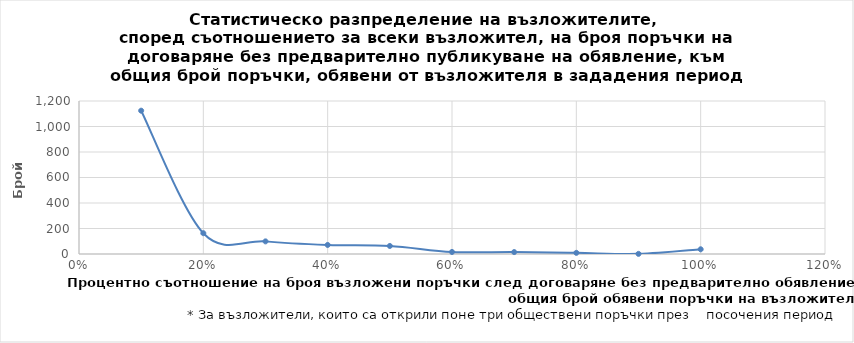
| Category | Series 0 |
|---|---|
| 0.1 | 1124 |
| 0.2 | 163 |
| 0.3 | 99 |
| 0.4 | 71 |
| 0.5 | 63 |
| 0.6 | 16 |
| 0.7 | 15 |
| 0.8 | 9 |
| 0.9 | 1 |
| 1.0 | 37 |